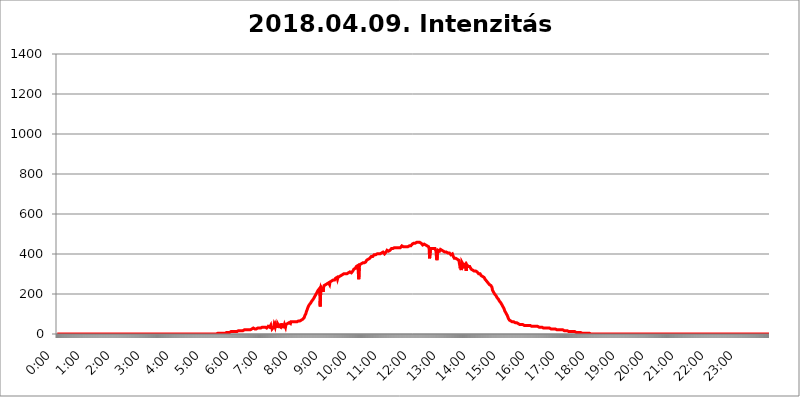
| Category | 2018.04.09. Intenzitás [W/m^2] |
|---|---|
| 0.0 | 0 |
| 0.0006944444444444445 | 0 |
| 0.001388888888888889 | 0 |
| 0.0020833333333333333 | 0 |
| 0.002777777777777778 | 0 |
| 0.003472222222222222 | 0 |
| 0.004166666666666667 | 0 |
| 0.004861111111111111 | 0 |
| 0.005555555555555556 | 0 |
| 0.0062499999999999995 | 0 |
| 0.006944444444444444 | 0 |
| 0.007638888888888889 | 0 |
| 0.008333333333333333 | 0 |
| 0.009027777777777779 | 0 |
| 0.009722222222222222 | 0 |
| 0.010416666666666666 | 0 |
| 0.011111111111111112 | 0 |
| 0.011805555555555555 | 0 |
| 0.012499999999999999 | 0 |
| 0.013194444444444444 | 0 |
| 0.013888888888888888 | 0 |
| 0.014583333333333332 | 0 |
| 0.015277777777777777 | 0 |
| 0.015972222222222224 | 0 |
| 0.016666666666666666 | 0 |
| 0.017361111111111112 | 0 |
| 0.018055555555555557 | 0 |
| 0.01875 | 0 |
| 0.019444444444444445 | 0 |
| 0.02013888888888889 | 0 |
| 0.020833333333333332 | 0 |
| 0.02152777777777778 | 0 |
| 0.022222222222222223 | 0 |
| 0.02291666666666667 | 0 |
| 0.02361111111111111 | 0 |
| 0.024305555555555556 | 0 |
| 0.024999999999999998 | 0 |
| 0.025694444444444447 | 0 |
| 0.02638888888888889 | 0 |
| 0.027083333333333334 | 0 |
| 0.027777777777777776 | 0 |
| 0.02847222222222222 | 0 |
| 0.029166666666666664 | 0 |
| 0.029861111111111113 | 0 |
| 0.030555555555555555 | 0 |
| 0.03125 | 0 |
| 0.03194444444444445 | 0 |
| 0.03263888888888889 | 0 |
| 0.03333333333333333 | 0 |
| 0.034027777777777775 | 0 |
| 0.034722222222222224 | 0 |
| 0.035416666666666666 | 0 |
| 0.036111111111111115 | 0 |
| 0.03680555555555556 | 0 |
| 0.0375 | 0 |
| 0.03819444444444444 | 0 |
| 0.03888888888888889 | 0 |
| 0.03958333333333333 | 0 |
| 0.04027777777777778 | 0 |
| 0.04097222222222222 | 0 |
| 0.041666666666666664 | 0 |
| 0.042361111111111106 | 0 |
| 0.04305555555555556 | 0 |
| 0.043750000000000004 | 0 |
| 0.044444444444444446 | 0 |
| 0.04513888888888889 | 0 |
| 0.04583333333333334 | 0 |
| 0.04652777777777778 | 0 |
| 0.04722222222222222 | 0 |
| 0.04791666666666666 | 0 |
| 0.04861111111111111 | 0 |
| 0.049305555555555554 | 0 |
| 0.049999999999999996 | 0 |
| 0.05069444444444445 | 0 |
| 0.051388888888888894 | 0 |
| 0.052083333333333336 | 0 |
| 0.05277777777777778 | 0 |
| 0.05347222222222222 | 0 |
| 0.05416666666666667 | 0 |
| 0.05486111111111111 | 0 |
| 0.05555555555555555 | 0 |
| 0.05625 | 0 |
| 0.05694444444444444 | 0 |
| 0.057638888888888885 | 0 |
| 0.05833333333333333 | 0 |
| 0.05902777777777778 | 0 |
| 0.059722222222222225 | 0 |
| 0.06041666666666667 | 0 |
| 0.061111111111111116 | 0 |
| 0.06180555555555556 | 0 |
| 0.0625 | 0 |
| 0.06319444444444444 | 0 |
| 0.06388888888888888 | 0 |
| 0.06458333333333334 | 0 |
| 0.06527777777777778 | 0 |
| 0.06597222222222222 | 0 |
| 0.06666666666666667 | 0 |
| 0.06736111111111111 | 0 |
| 0.06805555555555555 | 0 |
| 0.06874999999999999 | 0 |
| 0.06944444444444443 | 0 |
| 0.07013888888888889 | 0 |
| 0.07083333333333333 | 0 |
| 0.07152777777777779 | 0 |
| 0.07222222222222223 | 0 |
| 0.07291666666666667 | 0 |
| 0.07361111111111111 | 0 |
| 0.07430555555555556 | 0 |
| 0.075 | 0 |
| 0.07569444444444444 | 0 |
| 0.0763888888888889 | 0 |
| 0.07708333333333334 | 0 |
| 0.07777777777777778 | 0 |
| 0.07847222222222222 | 0 |
| 0.07916666666666666 | 0 |
| 0.0798611111111111 | 0 |
| 0.08055555555555556 | 0 |
| 0.08125 | 0 |
| 0.08194444444444444 | 0 |
| 0.08263888888888889 | 0 |
| 0.08333333333333333 | 0 |
| 0.08402777777777777 | 0 |
| 0.08472222222222221 | 0 |
| 0.08541666666666665 | 0 |
| 0.08611111111111112 | 0 |
| 0.08680555555555557 | 0 |
| 0.08750000000000001 | 0 |
| 0.08819444444444445 | 0 |
| 0.08888888888888889 | 0 |
| 0.08958333333333333 | 0 |
| 0.09027777777777778 | 0 |
| 0.09097222222222222 | 0 |
| 0.09166666666666667 | 0 |
| 0.09236111111111112 | 0 |
| 0.09305555555555556 | 0 |
| 0.09375 | 0 |
| 0.09444444444444444 | 0 |
| 0.09513888888888888 | 0 |
| 0.09583333333333333 | 0 |
| 0.09652777777777777 | 0 |
| 0.09722222222222222 | 0 |
| 0.09791666666666667 | 0 |
| 0.09861111111111111 | 0 |
| 0.09930555555555555 | 0 |
| 0.09999999999999999 | 0 |
| 0.10069444444444443 | 0 |
| 0.1013888888888889 | 0 |
| 0.10208333333333335 | 0 |
| 0.10277777777777779 | 0 |
| 0.10347222222222223 | 0 |
| 0.10416666666666667 | 0 |
| 0.10486111111111111 | 0 |
| 0.10555555555555556 | 0 |
| 0.10625 | 0 |
| 0.10694444444444444 | 0 |
| 0.1076388888888889 | 0 |
| 0.10833333333333334 | 0 |
| 0.10902777777777778 | 0 |
| 0.10972222222222222 | 0 |
| 0.1111111111111111 | 0 |
| 0.11180555555555556 | 0 |
| 0.11180555555555556 | 0 |
| 0.1125 | 0 |
| 0.11319444444444444 | 0 |
| 0.11388888888888889 | 0 |
| 0.11458333333333333 | 0 |
| 0.11527777777777777 | 0 |
| 0.11597222222222221 | 0 |
| 0.11666666666666665 | 0 |
| 0.1173611111111111 | 0 |
| 0.11805555555555557 | 0 |
| 0.11944444444444445 | 0 |
| 0.12013888888888889 | 0 |
| 0.12083333333333333 | 0 |
| 0.12152777777777778 | 0 |
| 0.12222222222222223 | 0 |
| 0.12291666666666667 | 0 |
| 0.12291666666666667 | 0 |
| 0.12361111111111112 | 0 |
| 0.12430555555555556 | 0 |
| 0.125 | 0 |
| 0.12569444444444444 | 0 |
| 0.12638888888888888 | 0 |
| 0.12708333333333333 | 0 |
| 0.16875 | 0 |
| 0.12847222222222224 | 0 |
| 0.12916666666666668 | 0 |
| 0.12986111111111112 | 0 |
| 0.13055555555555556 | 0 |
| 0.13125 | 0 |
| 0.13194444444444445 | 0 |
| 0.1326388888888889 | 0 |
| 0.13333333333333333 | 0 |
| 0.13402777777777777 | 0 |
| 0.13402777777777777 | 0 |
| 0.13472222222222222 | 0 |
| 0.13541666666666666 | 0 |
| 0.1361111111111111 | 0 |
| 0.13749999999999998 | 0 |
| 0.13819444444444443 | 0 |
| 0.1388888888888889 | 0 |
| 0.13958333333333334 | 0 |
| 0.14027777777777778 | 0 |
| 0.14097222222222222 | 0 |
| 0.14166666666666666 | 0 |
| 0.1423611111111111 | 0 |
| 0.14305555555555557 | 0 |
| 0.14375000000000002 | 0 |
| 0.14444444444444446 | 0 |
| 0.1451388888888889 | 0 |
| 0.1451388888888889 | 0 |
| 0.14652777777777778 | 0 |
| 0.14722222222222223 | 0 |
| 0.14791666666666667 | 0 |
| 0.1486111111111111 | 0 |
| 0.14930555555555555 | 0 |
| 0.15 | 0 |
| 0.15069444444444444 | 0 |
| 0.15138888888888888 | 0 |
| 0.15208333333333332 | 0 |
| 0.15277777777777776 | 0 |
| 0.15347222222222223 | 0 |
| 0.15416666666666667 | 0 |
| 0.15486111111111112 | 0 |
| 0.15555555555555556 | 0 |
| 0.15625 | 0 |
| 0.15694444444444444 | 0 |
| 0.15763888888888888 | 0 |
| 0.15833333333333333 | 0 |
| 0.15902777777777777 | 0 |
| 0.15972222222222224 | 0 |
| 0.16041666666666668 | 0 |
| 0.16111111111111112 | 0 |
| 0.16180555555555556 | 0 |
| 0.1625 | 0 |
| 0.16319444444444445 | 0 |
| 0.1638888888888889 | 0 |
| 0.16458333333333333 | 0 |
| 0.16527777777777777 | 0 |
| 0.16597222222222222 | 0 |
| 0.16666666666666666 | 0 |
| 0.1673611111111111 | 0 |
| 0.16805555555555554 | 0 |
| 0.16874999999999998 | 0 |
| 0.16944444444444443 | 0 |
| 0.17013888888888887 | 0 |
| 0.1708333333333333 | 0 |
| 0.17152777777777775 | 0 |
| 0.17222222222222225 | 0 |
| 0.1729166666666667 | 0 |
| 0.17361111111111113 | 0 |
| 0.17430555555555557 | 0 |
| 0.17500000000000002 | 0 |
| 0.17569444444444446 | 0 |
| 0.1763888888888889 | 0 |
| 0.17708333333333334 | 0 |
| 0.17777777777777778 | 0 |
| 0.17847222222222223 | 0 |
| 0.17916666666666667 | 0 |
| 0.1798611111111111 | 0 |
| 0.18055555555555555 | 0 |
| 0.18125 | 0 |
| 0.18194444444444444 | 0 |
| 0.1826388888888889 | 0 |
| 0.18333333333333335 | 0 |
| 0.1840277777777778 | 0 |
| 0.18472222222222223 | 0 |
| 0.18541666666666667 | 0 |
| 0.18611111111111112 | 0 |
| 0.18680555555555556 | 0 |
| 0.1875 | 0 |
| 0.18819444444444444 | 0 |
| 0.18888888888888888 | 0 |
| 0.18958333333333333 | 0 |
| 0.19027777777777777 | 0 |
| 0.1909722222222222 | 0 |
| 0.19166666666666665 | 0 |
| 0.19236111111111112 | 0 |
| 0.19305555555555554 | 0 |
| 0.19375 | 0 |
| 0.19444444444444445 | 0 |
| 0.1951388888888889 | 0 |
| 0.19583333333333333 | 0 |
| 0.19652777777777777 | 0 |
| 0.19722222222222222 | 0 |
| 0.19791666666666666 | 0 |
| 0.1986111111111111 | 0 |
| 0.19930555555555554 | 0 |
| 0.19999999999999998 | 0 |
| 0.20069444444444443 | 0 |
| 0.20138888888888887 | 0 |
| 0.2020833333333333 | 0 |
| 0.2027777777777778 | 0 |
| 0.2034722222222222 | 0 |
| 0.2041666666666667 | 0 |
| 0.20486111111111113 | 0 |
| 0.20555555555555557 | 0 |
| 0.20625000000000002 | 0 |
| 0.20694444444444446 | 0 |
| 0.2076388888888889 | 0 |
| 0.20833333333333334 | 0 |
| 0.20902777777777778 | 0 |
| 0.20972222222222223 | 0 |
| 0.21041666666666667 | 0 |
| 0.2111111111111111 | 0 |
| 0.21180555555555555 | 0 |
| 0.2125 | 0 |
| 0.21319444444444444 | 0 |
| 0.2138888888888889 | 0 |
| 0.21458333333333335 | 0 |
| 0.2152777777777778 | 0 |
| 0.21597222222222223 | 0 |
| 0.21666666666666667 | 0 |
| 0.21736111111111112 | 0 |
| 0.21805555555555556 | 0 |
| 0.21875 | 0 |
| 0.21944444444444444 | 0 |
| 0.22013888888888888 | 0 |
| 0.22083333333333333 | 0 |
| 0.22152777777777777 | 0 |
| 0.2222222222222222 | 0 |
| 0.22291666666666665 | 0 |
| 0.2236111111111111 | 0 |
| 0.22430555555555556 | 3.525 |
| 0.225 | 3.525 |
| 0.22569444444444445 | 3.525 |
| 0.2263888888888889 | 3.525 |
| 0.22708333333333333 | 3.525 |
| 0.22777777777777777 | 3.525 |
| 0.22847222222222222 | 3.525 |
| 0.22916666666666666 | 3.525 |
| 0.2298611111111111 | 3.525 |
| 0.23055555555555554 | 3.525 |
| 0.23124999999999998 | 3.525 |
| 0.23194444444444443 | 3.525 |
| 0.23263888888888887 | 3.525 |
| 0.2333333333333333 | 3.525 |
| 0.2340277777777778 | 3.525 |
| 0.2347222222222222 | 7.887 |
| 0.2354166666666667 | 3.525 |
| 0.23611111111111113 | 7.887 |
| 0.23680555555555557 | 7.887 |
| 0.23750000000000002 | 7.887 |
| 0.23819444444444446 | 7.887 |
| 0.2388888888888889 | 7.887 |
| 0.23958333333333334 | 7.887 |
| 0.24027777777777778 | 7.887 |
| 0.24097222222222223 | 7.887 |
| 0.24166666666666667 | 7.887 |
| 0.2423611111111111 | 12.257 |
| 0.24305555555555555 | 12.257 |
| 0.24375 | 12.257 |
| 0.24444444444444446 | 12.257 |
| 0.24513888888888888 | 12.257 |
| 0.24583333333333335 | 12.257 |
| 0.2465277777777778 | 12.257 |
| 0.24722222222222223 | 12.257 |
| 0.24791666666666667 | 12.257 |
| 0.24861111111111112 | 12.257 |
| 0.24930555555555556 | 12.257 |
| 0.25 | 12.257 |
| 0.25069444444444444 | 12.257 |
| 0.2513888888888889 | 12.257 |
| 0.2520833333333333 | 12.257 |
| 0.25277777777777777 | 12.257 |
| 0.2534722222222222 | 16.636 |
| 0.25416666666666665 | 16.636 |
| 0.2548611111111111 | 16.636 |
| 0.2555555555555556 | 16.636 |
| 0.25625000000000003 | 16.636 |
| 0.2569444444444445 | 16.636 |
| 0.2576388888888889 | 16.636 |
| 0.25833333333333336 | 16.636 |
| 0.2590277777777778 | 16.636 |
| 0.25972222222222224 | 16.636 |
| 0.2604166666666667 | 16.636 |
| 0.2611111111111111 | 16.636 |
| 0.26180555555555557 | 16.636 |
| 0.2625 | 21.024 |
| 0.26319444444444445 | 21.024 |
| 0.2638888888888889 | 21.024 |
| 0.26458333333333334 | 21.024 |
| 0.2652777777777778 | 21.024 |
| 0.2659722222222222 | 21.024 |
| 0.26666666666666666 | 21.024 |
| 0.2673611111111111 | 21.024 |
| 0.26805555555555555 | 21.024 |
| 0.26875 | 21.024 |
| 0.26944444444444443 | 21.024 |
| 0.2701388888888889 | 21.024 |
| 0.2708333333333333 | 21.024 |
| 0.27152777777777776 | 25.419 |
| 0.2722222222222222 | 25.419 |
| 0.27291666666666664 | 25.419 |
| 0.2736111111111111 | 25.419 |
| 0.2743055555555555 | 25.419 |
| 0.27499999999999997 | 29.823 |
| 0.27569444444444446 | 25.419 |
| 0.27638888888888885 | 25.419 |
| 0.27708333333333335 | 25.419 |
| 0.2777777777777778 | 25.419 |
| 0.27847222222222223 | 25.419 |
| 0.2791666666666667 | 25.419 |
| 0.2798611111111111 | 29.823 |
| 0.28055555555555556 | 29.823 |
| 0.28125 | 29.823 |
| 0.28194444444444444 | 29.823 |
| 0.2826388888888889 | 29.823 |
| 0.2833333333333333 | 29.823 |
| 0.28402777777777777 | 29.823 |
| 0.2847222222222222 | 29.823 |
| 0.28541666666666665 | 29.823 |
| 0.28611111111111115 | 29.823 |
| 0.28680555555555554 | 29.823 |
| 0.28750000000000003 | 34.234 |
| 0.2881944444444445 | 29.823 |
| 0.2888888888888889 | 34.234 |
| 0.28958333333333336 | 34.234 |
| 0.2902777777777778 | 34.234 |
| 0.29097222222222224 | 34.234 |
| 0.2916666666666667 | 34.234 |
| 0.2923611111111111 | 38.653 |
| 0.29305555555555557 | 38.653 |
| 0.29375 | 29.823 |
| 0.29444444444444445 | 25.419 |
| 0.2951388888888889 | 29.823 |
| 0.29583333333333334 | 38.653 |
| 0.2965277777777778 | 38.653 |
| 0.2972222222222222 | 38.653 |
| 0.29791666666666666 | 34.234 |
| 0.2986111111111111 | 38.653 |
| 0.29930555555555555 | 43.079 |
| 0.3 | 25.419 |
| 0.30069444444444443 | 38.653 |
| 0.3013888888888889 | 25.419 |
| 0.3020833333333333 | 29.823 |
| 0.30277777777777776 | 29.823 |
| 0.3034722222222222 | 34.234 |
| 0.30416666666666664 | 47.511 |
| 0.3048611111111111 | 43.079 |
| 0.3055555555555555 | 34.234 |
| 0.30624999999999997 | 47.511 |
| 0.3069444444444444 | 43.079 |
| 0.3076388888888889 | 43.079 |
| 0.30833333333333335 | 29.823 |
| 0.3090277777777778 | 51.951 |
| 0.30972222222222223 | 51.951 |
| 0.3104166666666667 | 47.511 |
| 0.3111111111111111 | 38.653 |
| 0.31180555555555556 | 34.234 |
| 0.3125 | 43.079 |
| 0.31319444444444444 | 34.234 |
| 0.3138888888888889 | 51.951 |
| 0.3145833333333333 | 34.234 |
| 0.31527777777777777 | 51.951 |
| 0.3159722222222222 | 29.823 |
| 0.31666666666666665 | 47.511 |
| 0.31736111111111115 | 29.823 |
| 0.31805555555555554 | 38.653 |
| 0.31875000000000003 | 47.511 |
| 0.3194444444444445 | 51.951 |
| 0.3201388888888889 | 34.234 |
| 0.32083333333333336 | 47.511 |
| 0.3215277777777778 | 47.511 |
| 0.32222222222222224 | 47.511 |
| 0.3229166666666667 | 51.951 |
| 0.3236111111111111 | 51.951 |
| 0.32430555555555557 | 51.951 |
| 0.325 | 56.398 |
| 0.32569444444444445 | 56.398 |
| 0.3263888888888889 | 56.398 |
| 0.32708333333333334 | 51.951 |
| 0.3277777777777778 | 60.85 |
| 0.3284722222222222 | 60.85 |
| 0.32916666666666666 | 60.85 |
| 0.3298611111111111 | 60.85 |
| 0.33055555555555555 | 60.85 |
| 0.33125 | 60.85 |
| 0.33194444444444443 | 60.85 |
| 0.3326388888888889 | 60.85 |
| 0.3333333333333333 | 60.85 |
| 0.3340277777777778 | 60.85 |
| 0.3347222222222222 | 60.85 |
| 0.3354166666666667 | 60.85 |
| 0.3361111111111111 | 60.85 |
| 0.3368055555555556 | 60.85 |
| 0.33749999999999997 | 60.85 |
| 0.33819444444444446 | 65.31 |
| 0.33888888888888885 | 65.31 |
| 0.33958333333333335 | 65.31 |
| 0.34027777777777773 | 65.31 |
| 0.34097222222222223 | 65.31 |
| 0.3416666666666666 | 65.31 |
| 0.3423611111111111 | 69.775 |
| 0.3430555555555555 | 69.775 |
| 0.34375 | 74.246 |
| 0.3444444444444445 | 74.246 |
| 0.3451388888888889 | 78.722 |
| 0.3458333333333334 | 78.722 |
| 0.34652777777777777 | 83.205 |
| 0.34722222222222227 | 92.184 |
| 0.34791666666666665 | 96.682 |
| 0.34861111111111115 | 101.184 |
| 0.34930555555555554 | 110.201 |
| 0.35000000000000003 | 114.716 |
| 0.3506944444444444 | 123.758 |
| 0.3513888888888889 | 128.284 |
| 0.3520833333333333 | 137.347 |
| 0.3527777777777778 | 141.884 |
| 0.3534722222222222 | 146.423 |
| 0.3541666666666667 | 146.423 |
| 0.3548611111111111 | 150.964 |
| 0.35555555555555557 | 155.509 |
| 0.35625 | 160.056 |
| 0.35694444444444445 | 164.605 |
| 0.3576388888888889 | 164.605 |
| 0.35833333333333334 | 169.156 |
| 0.3590277777777778 | 173.709 |
| 0.3597222222222222 | 178.264 |
| 0.36041666666666666 | 182.82 |
| 0.3611111111111111 | 187.378 |
| 0.36180555555555555 | 191.937 |
| 0.3625 | 196.497 |
| 0.36319444444444443 | 201.058 |
| 0.3638888888888889 | 205.62 |
| 0.3645833333333333 | 210.182 |
| 0.3652777777777778 | 214.746 |
| 0.3659722222222222 | 219.309 |
| 0.3666666666666667 | 223.873 |
| 0.3673611111111111 | 223.873 |
| 0.3680555555555556 | 228.436 |
| 0.36874999999999997 | 137.347 |
| 0.36944444444444446 | 201.058 |
| 0.37013888888888885 | 233 |
| 0.37083333333333335 | 233 |
| 0.37152777777777773 | 228.436 |
| 0.37222222222222223 | 219.309 |
| 0.3729166666666666 | 210.182 |
| 0.3736111111111111 | 233 |
| 0.3743055555555555 | 242.127 |
| 0.375 | 242.127 |
| 0.3756944444444445 | 242.127 |
| 0.3763888888888889 | 246.689 |
| 0.3770833333333334 | 246.689 |
| 0.37777777777777777 | 251.251 |
| 0.37847222222222227 | 251.251 |
| 0.37916666666666665 | 251.251 |
| 0.37986111111111115 | 251.251 |
| 0.38055555555555554 | 255.813 |
| 0.38125000000000003 | 260.373 |
| 0.3819444444444444 | 246.689 |
| 0.3826388888888889 | 260.373 |
| 0.3833333333333333 | 260.373 |
| 0.3840277777777778 | 260.373 |
| 0.3847222222222222 | 264.932 |
| 0.3854166666666667 | 269.49 |
| 0.3861111111111111 | 269.49 |
| 0.38680555555555557 | 269.49 |
| 0.3875 | 269.49 |
| 0.38819444444444445 | 274.047 |
| 0.3888888888888889 | 269.49 |
| 0.38958333333333334 | 269.49 |
| 0.3902777777777778 | 278.603 |
| 0.3909722222222222 | 278.603 |
| 0.39166666666666666 | 283.156 |
| 0.3923611111111111 | 283.156 |
| 0.39305555555555555 | 274.047 |
| 0.39375 | 283.156 |
| 0.39444444444444443 | 287.709 |
| 0.3951388888888889 | 287.709 |
| 0.3958333333333333 | 287.709 |
| 0.3965277777777778 | 292.259 |
| 0.3972222222222222 | 292.259 |
| 0.3979166666666667 | 292.259 |
| 0.3986111111111111 | 292.259 |
| 0.3993055555555556 | 296.808 |
| 0.39999999999999997 | 296.808 |
| 0.40069444444444446 | 301.354 |
| 0.40138888888888885 | 296.808 |
| 0.40208333333333335 | 301.354 |
| 0.40277777777777773 | 301.354 |
| 0.40347222222222223 | 301.354 |
| 0.4041666666666666 | 301.354 |
| 0.4048611111111111 | 301.354 |
| 0.4055555555555555 | 305.898 |
| 0.40625 | 301.354 |
| 0.4069444444444445 | 305.898 |
| 0.4076388888888889 | 305.898 |
| 0.4083333333333334 | 305.898 |
| 0.40902777777777777 | 305.898 |
| 0.40972222222222227 | 305.898 |
| 0.41041666666666665 | 310.44 |
| 0.41111111111111115 | 310.44 |
| 0.41180555555555554 | 310.44 |
| 0.41250000000000003 | 305.898 |
| 0.4131944444444444 | 305.898 |
| 0.4138888888888889 | 310.44 |
| 0.4145833333333333 | 314.98 |
| 0.4152777777777778 | 314.98 |
| 0.4159722222222222 | 324.052 |
| 0.4166666666666667 | 324.052 |
| 0.4173611111111111 | 324.052 |
| 0.41805555555555557 | 328.584 |
| 0.41875 | 333.113 |
| 0.41944444444444445 | 337.639 |
| 0.4201388888888889 | 337.639 |
| 0.42083333333333334 | 342.162 |
| 0.4215277777777778 | 342.162 |
| 0.4222222222222222 | 342.162 |
| 0.42291666666666666 | 274.047 |
| 0.4236111111111111 | 333.113 |
| 0.42430555555555555 | 346.682 |
| 0.425 | 342.162 |
| 0.42569444444444443 | 351.198 |
| 0.4263888888888889 | 351.198 |
| 0.4270833333333333 | 355.712 |
| 0.4277777777777778 | 351.198 |
| 0.4284722222222222 | 355.712 |
| 0.4291666666666667 | 355.712 |
| 0.4298611111111111 | 355.712 |
| 0.4305555555555556 | 355.712 |
| 0.43124999999999997 | 360.221 |
| 0.43194444444444446 | 360.221 |
| 0.43263888888888885 | 360.221 |
| 0.43333333333333335 | 364.728 |
| 0.43402777777777773 | 369.23 |
| 0.43472222222222223 | 369.23 |
| 0.4354166666666666 | 369.23 |
| 0.4361111111111111 | 373.729 |
| 0.4368055555555555 | 378.224 |
| 0.4375 | 373.729 |
| 0.4381944444444445 | 378.224 |
| 0.4388888888888889 | 382.715 |
| 0.4395833333333334 | 382.715 |
| 0.44027777777777777 | 387.202 |
| 0.44097222222222227 | 382.715 |
| 0.44166666666666665 | 382.715 |
| 0.44236111111111115 | 387.202 |
| 0.44305555555555554 | 391.685 |
| 0.44375000000000003 | 391.685 |
| 0.4444444444444444 | 396.164 |
| 0.4451388888888889 | 396.164 |
| 0.4458333333333333 | 396.164 |
| 0.4465277777777778 | 396.164 |
| 0.4472222222222222 | 400.638 |
| 0.4479166666666667 | 400.638 |
| 0.4486111111111111 | 400.638 |
| 0.44930555555555557 | 396.164 |
| 0.45 | 400.638 |
| 0.45069444444444445 | 400.638 |
| 0.4513888888888889 | 400.638 |
| 0.45208333333333334 | 400.638 |
| 0.4527777777777778 | 400.638 |
| 0.4534722222222222 | 405.108 |
| 0.45416666666666666 | 400.638 |
| 0.4548611111111111 | 405.108 |
| 0.45555555555555555 | 405.108 |
| 0.45625 | 409.574 |
| 0.45694444444444443 | 409.574 |
| 0.4576388888888889 | 409.574 |
| 0.4583333333333333 | 405.108 |
| 0.4590277777777778 | 400.638 |
| 0.4597222222222222 | 400.638 |
| 0.4604166666666667 | 400.638 |
| 0.4611111111111111 | 409.574 |
| 0.4618055555555556 | 405.108 |
| 0.46249999999999997 | 418.492 |
| 0.46319444444444446 | 414.035 |
| 0.46388888888888885 | 418.492 |
| 0.46458333333333335 | 414.035 |
| 0.46527777777777773 | 414.035 |
| 0.46597222222222223 | 414.035 |
| 0.4666666666666666 | 418.492 |
| 0.4673611111111111 | 422.943 |
| 0.4680555555555555 | 422.943 |
| 0.46875 | 427.39 |
| 0.4694444444444445 | 427.39 |
| 0.4701388888888889 | 427.39 |
| 0.4708333333333334 | 427.39 |
| 0.47152777777777777 | 427.39 |
| 0.47222222222222227 | 431.833 |
| 0.47291666666666665 | 431.833 |
| 0.47361111111111115 | 431.833 |
| 0.47430555555555554 | 431.833 |
| 0.47500000000000003 | 431.833 |
| 0.4756944444444444 | 431.833 |
| 0.4763888888888889 | 427.39 |
| 0.4770833333333333 | 431.833 |
| 0.4777777777777778 | 431.833 |
| 0.4784722222222222 | 431.833 |
| 0.4791666666666667 | 431.833 |
| 0.4798611111111111 | 431.833 |
| 0.48055555555555557 | 431.833 |
| 0.48125 | 431.833 |
| 0.48194444444444445 | 431.833 |
| 0.4826388888888889 | 436.27 |
| 0.48333333333333334 | 440.702 |
| 0.4840277777777778 | 440.702 |
| 0.4847222222222222 | 436.27 |
| 0.48541666666666666 | 436.27 |
| 0.4861111111111111 | 436.27 |
| 0.48680555555555555 | 436.27 |
| 0.4875 | 436.27 |
| 0.48819444444444443 | 431.833 |
| 0.4888888888888889 | 436.27 |
| 0.4895833333333333 | 436.27 |
| 0.4902777777777778 | 436.27 |
| 0.4909722222222222 | 436.27 |
| 0.4916666666666667 | 436.27 |
| 0.4923611111111111 | 440.702 |
| 0.4930555555555556 | 440.702 |
| 0.49374999999999997 | 440.702 |
| 0.49444444444444446 | 440.702 |
| 0.49513888888888885 | 440.702 |
| 0.49583333333333335 | 440.702 |
| 0.49652777777777773 | 445.129 |
| 0.49722222222222223 | 445.129 |
| 0.4979166666666666 | 449.551 |
| 0.4986111111111111 | 449.551 |
| 0.4993055555555555 | 453.968 |
| 0.5 | 453.968 |
| 0.5006944444444444 | 453.968 |
| 0.5013888888888889 | 453.968 |
| 0.5020833333333333 | 453.968 |
| 0.5027777777777778 | 453.968 |
| 0.5034722222222222 | 453.968 |
| 0.5041666666666667 | 458.38 |
| 0.5048611111111111 | 458.38 |
| 0.5055555555555555 | 458.38 |
| 0.50625 | 458.38 |
| 0.5069444444444444 | 458.38 |
| 0.5076388888888889 | 453.968 |
| 0.5083333333333333 | 458.38 |
| 0.5090277777777777 | 453.968 |
| 0.5097222222222222 | 453.968 |
| 0.5104166666666666 | 453.968 |
| 0.5111111111111112 | 453.968 |
| 0.5118055555555555 | 449.551 |
| 0.5125000000000001 | 445.129 |
| 0.5131944444444444 | 445.129 |
| 0.513888888888889 | 445.129 |
| 0.5145833333333333 | 449.551 |
| 0.5152777777777778 | 445.129 |
| 0.5159722222222222 | 445.129 |
| 0.5166666666666667 | 445.129 |
| 0.517361111111111 | 445.129 |
| 0.5180555555555556 | 445.129 |
| 0.5187499999999999 | 440.702 |
| 0.5194444444444445 | 440.702 |
| 0.5201388888888888 | 440.702 |
| 0.5208333333333334 | 436.27 |
| 0.5215277777777778 | 427.39 |
| 0.5222222222222223 | 378.224 |
| 0.5229166666666667 | 378.224 |
| 0.5236111111111111 | 427.39 |
| 0.5243055555555556 | 431.833 |
| 0.525 | 431.833 |
| 0.5256944444444445 | 427.39 |
| 0.5263888888888889 | 427.39 |
| 0.5270833333333333 | 427.39 |
| 0.5277777777777778 | 427.39 |
| 0.5284722222222222 | 431.833 |
| 0.5291666666666667 | 431.833 |
| 0.5298611111111111 | 427.39 |
| 0.5305555555555556 | 422.943 |
| 0.53125 | 414.035 |
| 0.5319444444444444 | 378.224 |
| 0.5326388888888889 | 369.23 |
| 0.5333333333333333 | 409.574 |
| 0.5340277777777778 | 418.492 |
| 0.5347222222222222 | 418.492 |
| 0.5354166666666667 | 418.492 |
| 0.5361111111111111 | 414.035 |
| 0.5368055555555555 | 418.492 |
| 0.5375 | 422.943 |
| 0.5381944444444444 | 422.943 |
| 0.5388888888888889 | 422.943 |
| 0.5395833333333333 | 418.492 |
| 0.5402777777777777 | 418.492 |
| 0.5409722222222222 | 414.035 |
| 0.5416666666666666 | 414.035 |
| 0.5423611111111112 | 414.035 |
| 0.5430555555555555 | 409.574 |
| 0.5437500000000001 | 409.574 |
| 0.5444444444444444 | 409.574 |
| 0.545138888888889 | 409.574 |
| 0.5458333333333333 | 409.574 |
| 0.5465277777777778 | 405.108 |
| 0.5472222222222222 | 409.574 |
| 0.5479166666666667 | 405.108 |
| 0.548611111111111 | 405.108 |
| 0.5493055555555556 | 405.108 |
| 0.5499999999999999 | 405.108 |
| 0.5506944444444445 | 405.108 |
| 0.5513888888888888 | 400.638 |
| 0.5520833333333334 | 396.164 |
| 0.5527777777777778 | 396.164 |
| 0.5534722222222223 | 396.164 |
| 0.5541666666666667 | 400.638 |
| 0.5548611111111111 | 396.164 |
| 0.5555555555555556 | 387.202 |
| 0.55625 | 387.202 |
| 0.5569444444444445 | 378.224 |
| 0.5576388888888889 | 378.224 |
| 0.5583333333333333 | 378.224 |
| 0.5590277777777778 | 378.224 |
| 0.5597222222222222 | 378.224 |
| 0.5604166666666667 | 378.224 |
| 0.5611111111111111 | 373.729 |
| 0.5618055555555556 | 373.729 |
| 0.5625 | 369.23 |
| 0.5631944444444444 | 369.23 |
| 0.5638888888888889 | 369.23 |
| 0.5645833333333333 | 364.728 |
| 0.5652777777777778 | 328.584 |
| 0.5659722222222222 | 355.712 |
| 0.5666666666666667 | 319.517 |
| 0.5673611111111111 | 360.221 |
| 0.5680555555555555 | 355.712 |
| 0.56875 | 351.198 |
| 0.5694444444444444 | 328.584 |
| 0.5701388888888889 | 324.052 |
| 0.5708333333333333 | 346.682 |
| 0.5715277777777777 | 351.198 |
| 0.5722222222222222 | 351.198 |
| 0.5729166666666666 | 351.198 |
| 0.5736111111111112 | 314.98 |
| 0.5743055555555555 | 346.682 |
| 0.5750000000000001 | 342.162 |
| 0.5756944444444444 | 342.162 |
| 0.576388888888889 | 337.639 |
| 0.5770833333333333 | 337.639 |
| 0.5777777777777778 | 337.639 |
| 0.5784722222222222 | 337.639 |
| 0.5791666666666667 | 333.113 |
| 0.579861111111111 | 333.113 |
| 0.5805555555555556 | 324.052 |
| 0.5812499999999999 | 328.584 |
| 0.5819444444444445 | 324.052 |
| 0.5826388888888888 | 319.517 |
| 0.5833333333333334 | 324.052 |
| 0.5840277777777778 | 319.517 |
| 0.5847222222222223 | 314.98 |
| 0.5854166666666667 | 314.98 |
| 0.5861111111111111 | 314.98 |
| 0.5868055555555556 | 314.98 |
| 0.5875 | 314.98 |
| 0.5881944444444445 | 310.44 |
| 0.5888888888888889 | 310.44 |
| 0.5895833333333333 | 305.898 |
| 0.5902777777777778 | 305.898 |
| 0.5909722222222222 | 301.354 |
| 0.5916666666666667 | 301.354 |
| 0.5923611111111111 | 305.898 |
| 0.5930555555555556 | 301.354 |
| 0.59375 | 296.808 |
| 0.5944444444444444 | 292.259 |
| 0.5951388888888889 | 287.709 |
| 0.5958333333333333 | 287.709 |
| 0.5965277777777778 | 287.709 |
| 0.5972222222222222 | 287.709 |
| 0.5979166666666667 | 283.156 |
| 0.5986111111111111 | 283.156 |
| 0.5993055555555555 | 278.603 |
| 0.6 | 274.047 |
| 0.6006944444444444 | 274.047 |
| 0.6013888888888889 | 269.49 |
| 0.6020833333333333 | 264.932 |
| 0.6027777777777777 | 264.932 |
| 0.6034722222222222 | 260.373 |
| 0.6041666666666666 | 255.813 |
| 0.6048611111111112 | 251.251 |
| 0.6055555555555555 | 251.251 |
| 0.6062500000000001 | 246.689 |
| 0.6069444444444444 | 246.689 |
| 0.607638888888889 | 242.127 |
| 0.6083333333333333 | 242.127 |
| 0.6090277777777778 | 237.564 |
| 0.6097222222222222 | 233 |
| 0.6104166666666667 | 219.309 |
| 0.611111111111111 | 214.746 |
| 0.6118055555555556 | 210.182 |
| 0.6124999999999999 | 205.62 |
| 0.6131944444444445 | 201.058 |
| 0.6138888888888888 | 196.497 |
| 0.6145833333333334 | 196.497 |
| 0.6152777777777778 | 191.937 |
| 0.6159722222222223 | 187.378 |
| 0.6166666666666667 | 182.82 |
| 0.6173611111111111 | 178.264 |
| 0.6180555555555556 | 178.264 |
| 0.61875 | 173.709 |
| 0.6194444444444445 | 169.156 |
| 0.6201388888888889 | 164.605 |
| 0.6208333333333333 | 164.605 |
| 0.6215277777777778 | 160.056 |
| 0.6222222222222222 | 155.509 |
| 0.6229166666666667 | 150.964 |
| 0.6236111111111111 | 146.423 |
| 0.6243055555555556 | 141.884 |
| 0.625 | 137.347 |
| 0.6256944444444444 | 132.814 |
| 0.6263888888888889 | 128.284 |
| 0.6270833333333333 | 123.758 |
| 0.6277777777777778 | 114.716 |
| 0.6284722222222222 | 110.201 |
| 0.6291666666666667 | 105.69 |
| 0.6298611111111111 | 101.184 |
| 0.6305555555555555 | 101.184 |
| 0.63125 | 92.184 |
| 0.6319444444444444 | 87.692 |
| 0.6326388888888889 | 78.722 |
| 0.6333333333333333 | 74.246 |
| 0.6340277777777777 | 69.775 |
| 0.6347222222222222 | 65.31 |
| 0.6354166666666666 | 65.31 |
| 0.6361111111111112 | 65.31 |
| 0.6368055555555555 | 65.31 |
| 0.6375000000000001 | 65.31 |
| 0.6381944444444444 | 60.85 |
| 0.638888888888889 | 60.85 |
| 0.6395833333333333 | 60.85 |
| 0.6402777777777778 | 60.85 |
| 0.6409722222222222 | 60.85 |
| 0.6416666666666667 | 56.398 |
| 0.642361111111111 | 56.398 |
| 0.6430555555555556 | 56.398 |
| 0.6437499999999999 | 56.398 |
| 0.6444444444444445 | 56.398 |
| 0.6451388888888888 | 56.398 |
| 0.6458333333333334 | 51.951 |
| 0.6465277777777778 | 51.951 |
| 0.6472222222222223 | 51.951 |
| 0.6479166666666667 | 51.951 |
| 0.6486111111111111 | 47.511 |
| 0.6493055555555556 | 47.511 |
| 0.65 | 47.511 |
| 0.6506944444444445 | 47.511 |
| 0.6513888888888889 | 47.511 |
| 0.6520833333333333 | 47.511 |
| 0.6527777777777778 | 47.511 |
| 0.6534722222222222 | 47.511 |
| 0.6541666666666667 | 47.511 |
| 0.6548611111111111 | 43.079 |
| 0.6555555555555556 | 43.079 |
| 0.65625 | 43.079 |
| 0.6569444444444444 | 43.079 |
| 0.6576388888888889 | 43.079 |
| 0.6583333333333333 | 43.079 |
| 0.6590277777777778 | 43.079 |
| 0.6597222222222222 | 43.079 |
| 0.6604166666666667 | 43.079 |
| 0.6611111111111111 | 43.079 |
| 0.6618055555555555 | 43.079 |
| 0.6625 | 38.653 |
| 0.6631944444444444 | 43.079 |
| 0.6638888888888889 | 38.653 |
| 0.6645833333333333 | 38.653 |
| 0.6652777777777777 | 38.653 |
| 0.6659722222222222 | 38.653 |
| 0.6666666666666666 | 38.653 |
| 0.6673611111111111 | 38.653 |
| 0.6680555555555556 | 38.653 |
| 0.6687500000000001 | 38.653 |
| 0.6694444444444444 | 38.653 |
| 0.6701388888888888 | 38.653 |
| 0.6708333333333334 | 38.653 |
| 0.6715277777777778 | 38.653 |
| 0.6722222222222222 | 38.653 |
| 0.6729166666666666 | 34.234 |
| 0.6736111111111112 | 38.653 |
| 0.6743055555555556 | 34.234 |
| 0.6749999999999999 | 34.234 |
| 0.6756944444444444 | 34.234 |
| 0.6763888888888889 | 34.234 |
| 0.6770833333333334 | 34.234 |
| 0.6777777777777777 | 34.234 |
| 0.6784722222222223 | 34.234 |
| 0.6791666666666667 | 34.234 |
| 0.6798611111111111 | 34.234 |
| 0.6805555555555555 | 29.823 |
| 0.68125 | 34.234 |
| 0.6819444444444445 | 29.823 |
| 0.6826388888888889 | 29.823 |
| 0.6833333333333332 | 29.823 |
| 0.6840277777777778 | 29.823 |
| 0.6847222222222222 | 29.823 |
| 0.6854166666666667 | 29.823 |
| 0.686111111111111 | 29.823 |
| 0.6868055555555556 | 29.823 |
| 0.6875 | 29.823 |
| 0.6881944444444444 | 29.823 |
| 0.688888888888889 | 29.823 |
| 0.6895833333333333 | 29.823 |
| 0.6902777777777778 | 29.823 |
| 0.6909722222222222 | 25.419 |
| 0.6916666666666668 | 25.419 |
| 0.6923611111111111 | 25.419 |
| 0.6930555555555555 | 25.419 |
| 0.69375 | 25.419 |
| 0.6944444444444445 | 25.419 |
| 0.6951388888888889 | 25.419 |
| 0.6958333333333333 | 25.419 |
| 0.6965277777777777 | 25.419 |
| 0.6972222222222223 | 25.419 |
| 0.6979166666666666 | 25.419 |
| 0.6986111111111111 | 25.419 |
| 0.6993055555555556 | 25.419 |
| 0.7000000000000001 | 21.024 |
| 0.7006944444444444 | 21.024 |
| 0.7013888888888888 | 21.024 |
| 0.7020833333333334 | 21.024 |
| 0.7027777777777778 | 21.024 |
| 0.7034722222222222 | 21.024 |
| 0.7041666666666666 | 21.024 |
| 0.7048611111111112 | 21.024 |
| 0.7055555555555556 | 21.024 |
| 0.7062499999999999 | 21.024 |
| 0.7069444444444444 | 21.024 |
| 0.7076388888888889 | 21.024 |
| 0.7083333333333334 | 21.024 |
| 0.7090277777777777 | 21.024 |
| 0.7097222222222223 | 16.636 |
| 0.7104166666666667 | 16.636 |
| 0.7111111111111111 | 16.636 |
| 0.7118055555555555 | 16.636 |
| 0.7125 | 16.636 |
| 0.7131944444444445 | 16.636 |
| 0.7138888888888889 | 16.636 |
| 0.7145833333333332 | 16.636 |
| 0.7152777777777778 | 16.636 |
| 0.7159722222222222 | 16.636 |
| 0.7166666666666667 | 12.257 |
| 0.717361111111111 | 12.257 |
| 0.7180555555555556 | 12.257 |
| 0.71875 | 12.257 |
| 0.7194444444444444 | 12.257 |
| 0.720138888888889 | 12.257 |
| 0.7208333333333333 | 12.257 |
| 0.7215277777777778 | 12.257 |
| 0.7222222222222222 | 12.257 |
| 0.7229166666666668 | 12.257 |
| 0.7236111111111111 | 12.257 |
| 0.7243055555555555 | 12.257 |
| 0.725 | 12.257 |
| 0.7256944444444445 | 12.257 |
| 0.7263888888888889 | 12.257 |
| 0.7270833333333333 | 7.887 |
| 0.7277777777777777 | 7.887 |
| 0.7284722222222223 | 7.887 |
| 0.7291666666666666 | 7.887 |
| 0.7298611111111111 | 7.887 |
| 0.7305555555555556 | 7.887 |
| 0.7312500000000001 | 7.887 |
| 0.7319444444444444 | 7.887 |
| 0.7326388888888888 | 7.887 |
| 0.7333333333333334 | 7.887 |
| 0.7340277777777778 | 7.887 |
| 0.7347222222222222 | 7.887 |
| 0.7354166666666666 | 7.887 |
| 0.7361111111111112 | 3.525 |
| 0.7368055555555556 | 3.525 |
| 0.7374999999999999 | 3.525 |
| 0.7381944444444444 | 3.525 |
| 0.7388888888888889 | 3.525 |
| 0.7395833333333334 | 3.525 |
| 0.7402777777777777 | 3.525 |
| 0.7409722222222223 | 3.525 |
| 0.7416666666666667 | 3.525 |
| 0.7423611111111111 | 3.525 |
| 0.7430555555555555 | 3.525 |
| 0.74375 | 3.525 |
| 0.7444444444444445 | 3.525 |
| 0.7451388888888889 | 3.525 |
| 0.7458333333333332 | 3.525 |
| 0.7465277777777778 | 3.525 |
| 0.7472222222222222 | 3.525 |
| 0.7479166666666667 | 3.525 |
| 0.748611111111111 | 0 |
| 0.7493055555555556 | 0 |
| 0.75 | 0 |
| 0.7506944444444444 | 0 |
| 0.751388888888889 | 0 |
| 0.7520833333333333 | 0 |
| 0.7527777777777778 | 0 |
| 0.7534722222222222 | 0 |
| 0.7541666666666668 | 0 |
| 0.7548611111111111 | 0 |
| 0.7555555555555555 | 0 |
| 0.75625 | 0 |
| 0.7569444444444445 | 0 |
| 0.7576388888888889 | 0 |
| 0.7583333333333333 | 0 |
| 0.7590277777777777 | 0 |
| 0.7597222222222223 | 0 |
| 0.7604166666666666 | 0 |
| 0.7611111111111111 | 0 |
| 0.7618055555555556 | 0 |
| 0.7625000000000001 | 0 |
| 0.7631944444444444 | 0 |
| 0.7638888888888888 | 0 |
| 0.7645833333333334 | 0 |
| 0.7652777777777778 | 0 |
| 0.7659722222222222 | 0 |
| 0.7666666666666666 | 0 |
| 0.7673611111111112 | 0 |
| 0.7680555555555556 | 0 |
| 0.7687499999999999 | 0 |
| 0.7694444444444444 | 0 |
| 0.7701388888888889 | 0 |
| 0.7708333333333334 | 0 |
| 0.7715277777777777 | 0 |
| 0.7722222222222223 | 0 |
| 0.7729166666666667 | 0 |
| 0.7736111111111111 | 0 |
| 0.7743055555555555 | 0 |
| 0.775 | 0 |
| 0.7756944444444445 | 0 |
| 0.7763888888888889 | 0 |
| 0.7770833333333332 | 0 |
| 0.7777777777777778 | 0 |
| 0.7784722222222222 | 0 |
| 0.7791666666666667 | 0 |
| 0.779861111111111 | 0 |
| 0.7805555555555556 | 0 |
| 0.78125 | 0 |
| 0.7819444444444444 | 0 |
| 0.782638888888889 | 0 |
| 0.7833333333333333 | 0 |
| 0.7840277777777778 | 0 |
| 0.7847222222222222 | 0 |
| 0.7854166666666668 | 0 |
| 0.7861111111111111 | 0 |
| 0.7868055555555555 | 0 |
| 0.7875 | 0 |
| 0.7881944444444445 | 0 |
| 0.7888888888888889 | 0 |
| 0.7895833333333333 | 0 |
| 0.7902777777777777 | 0 |
| 0.7909722222222223 | 0 |
| 0.7916666666666666 | 0 |
| 0.7923611111111111 | 0 |
| 0.7930555555555556 | 0 |
| 0.7937500000000001 | 0 |
| 0.7944444444444444 | 0 |
| 0.7951388888888888 | 0 |
| 0.7958333333333334 | 0 |
| 0.7965277777777778 | 0 |
| 0.7972222222222222 | 0 |
| 0.7979166666666666 | 0 |
| 0.7986111111111112 | 0 |
| 0.7993055555555556 | 0 |
| 0.7999999999999999 | 0 |
| 0.8006944444444444 | 0 |
| 0.8013888888888889 | 0 |
| 0.8020833333333334 | 0 |
| 0.8027777777777777 | 0 |
| 0.8034722222222223 | 0 |
| 0.8041666666666667 | 0 |
| 0.8048611111111111 | 0 |
| 0.8055555555555555 | 0 |
| 0.80625 | 0 |
| 0.8069444444444445 | 0 |
| 0.8076388888888889 | 0 |
| 0.8083333333333332 | 0 |
| 0.8090277777777778 | 0 |
| 0.8097222222222222 | 0 |
| 0.8104166666666667 | 0 |
| 0.811111111111111 | 0 |
| 0.8118055555555556 | 0 |
| 0.8125 | 0 |
| 0.8131944444444444 | 0 |
| 0.813888888888889 | 0 |
| 0.8145833333333333 | 0 |
| 0.8152777777777778 | 0 |
| 0.8159722222222222 | 0 |
| 0.8166666666666668 | 0 |
| 0.8173611111111111 | 0 |
| 0.8180555555555555 | 0 |
| 0.81875 | 0 |
| 0.8194444444444445 | 0 |
| 0.8201388888888889 | 0 |
| 0.8208333333333333 | 0 |
| 0.8215277777777777 | 0 |
| 0.8222222222222223 | 0 |
| 0.8229166666666666 | 0 |
| 0.8236111111111111 | 0 |
| 0.8243055555555556 | 0 |
| 0.8250000000000001 | 0 |
| 0.8256944444444444 | 0 |
| 0.8263888888888888 | 0 |
| 0.8270833333333334 | 0 |
| 0.8277777777777778 | 0 |
| 0.8284722222222222 | 0 |
| 0.8291666666666666 | 0 |
| 0.8298611111111112 | 0 |
| 0.8305555555555556 | 0 |
| 0.8312499999999999 | 0 |
| 0.8319444444444444 | 0 |
| 0.8326388888888889 | 0 |
| 0.8333333333333334 | 0 |
| 0.8340277777777777 | 0 |
| 0.8347222222222223 | 0 |
| 0.8354166666666667 | 0 |
| 0.8361111111111111 | 0 |
| 0.8368055555555555 | 0 |
| 0.8375 | 0 |
| 0.8381944444444445 | 0 |
| 0.8388888888888889 | 0 |
| 0.8395833333333332 | 0 |
| 0.8402777777777778 | 0 |
| 0.8409722222222222 | 0 |
| 0.8416666666666667 | 0 |
| 0.842361111111111 | 0 |
| 0.8430555555555556 | 0 |
| 0.84375 | 0 |
| 0.8444444444444444 | 0 |
| 0.845138888888889 | 0 |
| 0.8458333333333333 | 0 |
| 0.8465277777777778 | 0 |
| 0.8472222222222222 | 0 |
| 0.8479166666666668 | 0 |
| 0.8486111111111111 | 0 |
| 0.8493055555555555 | 0 |
| 0.85 | 0 |
| 0.8506944444444445 | 0 |
| 0.8513888888888889 | 0 |
| 0.8520833333333333 | 0 |
| 0.8527777777777777 | 0 |
| 0.8534722222222223 | 0 |
| 0.8541666666666666 | 0 |
| 0.8548611111111111 | 0 |
| 0.8555555555555556 | 0 |
| 0.8562500000000001 | 0 |
| 0.8569444444444444 | 0 |
| 0.8576388888888888 | 0 |
| 0.8583333333333334 | 0 |
| 0.8590277777777778 | 0 |
| 0.8597222222222222 | 0 |
| 0.8604166666666666 | 0 |
| 0.8611111111111112 | 0 |
| 0.8618055555555556 | 0 |
| 0.8624999999999999 | 0 |
| 0.8631944444444444 | 0 |
| 0.8638888888888889 | 0 |
| 0.8645833333333334 | 0 |
| 0.8652777777777777 | 0 |
| 0.8659722222222223 | 0 |
| 0.8666666666666667 | 0 |
| 0.8673611111111111 | 0 |
| 0.8680555555555555 | 0 |
| 0.86875 | 0 |
| 0.8694444444444445 | 0 |
| 0.8701388888888889 | 0 |
| 0.8708333333333332 | 0 |
| 0.8715277777777778 | 0 |
| 0.8722222222222222 | 0 |
| 0.8729166666666667 | 0 |
| 0.873611111111111 | 0 |
| 0.8743055555555556 | 0 |
| 0.875 | 0 |
| 0.8756944444444444 | 0 |
| 0.876388888888889 | 0 |
| 0.8770833333333333 | 0 |
| 0.8777777777777778 | 0 |
| 0.8784722222222222 | 0 |
| 0.8791666666666668 | 0 |
| 0.8798611111111111 | 0 |
| 0.8805555555555555 | 0 |
| 0.88125 | 0 |
| 0.8819444444444445 | 0 |
| 0.8826388888888889 | 0 |
| 0.8833333333333333 | 0 |
| 0.8840277777777777 | 0 |
| 0.8847222222222223 | 0 |
| 0.8854166666666666 | 0 |
| 0.8861111111111111 | 0 |
| 0.8868055555555556 | 0 |
| 0.8875000000000001 | 0 |
| 0.8881944444444444 | 0 |
| 0.8888888888888888 | 0 |
| 0.8895833333333334 | 0 |
| 0.8902777777777778 | 0 |
| 0.8909722222222222 | 0 |
| 0.8916666666666666 | 0 |
| 0.8923611111111112 | 0 |
| 0.8930555555555556 | 0 |
| 0.8937499999999999 | 0 |
| 0.8944444444444444 | 0 |
| 0.8951388888888889 | 0 |
| 0.8958333333333334 | 0 |
| 0.8965277777777777 | 0 |
| 0.8972222222222223 | 0 |
| 0.8979166666666667 | 0 |
| 0.8986111111111111 | 0 |
| 0.8993055555555555 | 0 |
| 0.9 | 0 |
| 0.9006944444444445 | 0 |
| 0.9013888888888889 | 0 |
| 0.9020833333333332 | 0 |
| 0.9027777777777778 | 0 |
| 0.9034722222222222 | 0 |
| 0.9041666666666667 | 0 |
| 0.904861111111111 | 0 |
| 0.9055555555555556 | 0 |
| 0.90625 | 0 |
| 0.9069444444444444 | 0 |
| 0.907638888888889 | 0 |
| 0.9083333333333333 | 0 |
| 0.9090277777777778 | 0 |
| 0.9097222222222222 | 0 |
| 0.9104166666666668 | 0 |
| 0.9111111111111111 | 0 |
| 0.9118055555555555 | 0 |
| 0.9125 | 0 |
| 0.9131944444444445 | 0 |
| 0.9138888888888889 | 0 |
| 0.9145833333333333 | 0 |
| 0.9152777777777777 | 0 |
| 0.9159722222222223 | 0 |
| 0.9166666666666666 | 0 |
| 0.9173611111111111 | 0 |
| 0.9180555555555556 | 0 |
| 0.9187500000000001 | 0 |
| 0.9194444444444444 | 0 |
| 0.9201388888888888 | 0 |
| 0.9208333333333334 | 0 |
| 0.9215277777777778 | 0 |
| 0.9222222222222222 | 0 |
| 0.9229166666666666 | 0 |
| 0.9236111111111112 | 0 |
| 0.9243055555555556 | 0 |
| 0.9249999999999999 | 0 |
| 0.9256944444444444 | 0 |
| 0.9263888888888889 | 0 |
| 0.9270833333333334 | 0 |
| 0.9277777777777777 | 0 |
| 0.9284722222222223 | 0 |
| 0.9291666666666667 | 0 |
| 0.9298611111111111 | 0 |
| 0.9305555555555555 | 0 |
| 0.93125 | 0 |
| 0.9319444444444445 | 0 |
| 0.9326388888888889 | 0 |
| 0.9333333333333332 | 0 |
| 0.9340277777777778 | 0 |
| 0.9347222222222222 | 0 |
| 0.9354166666666667 | 0 |
| 0.936111111111111 | 0 |
| 0.9368055555555556 | 0 |
| 0.9375 | 0 |
| 0.9381944444444444 | 0 |
| 0.938888888888889 | 0 |
| 0.9395833333333333 | 0 |
| 0.9402777777777778 | 0 |
| 0.9409722222222222 | 0 |
| 0.9416666666666668 | 0 |
| 0.9423611111111111 | 0 |
| 0.9430555555555555 | 0 |
| 0.94375 | 0 |
| 0.9444444444444445 | 0 |
| 0.9451388888888889 | 0 |
| 0.9458333333333333 | 0 |
| 0.9465277777777777 | 0 |
| 0.9472222222222223 | 0 |
| 0.9479166666666666 | 0 |
| 0.9486111111111111 | 0 |
| 0.9493055555555556 | 0 |
| 0.9500000000000001 | 0 |
| 0.9506944444444444 | 0 |
| 0.9513888888888888 | 0 |
| 0.9520833333333334 | 0 |
| 0.9527777777777778 | 0 |
| 0.9534722222222222 | 0 |
| 0.9541666666666666 | 0 |
| 0.9548611111111112 | 0 |
| 0.9555555555555556 | 0 |
| 0.9562499999999999 | 0 |
| 0.9569444444444444 | 0 |
| 0.9576388888888889 | 0 |
| 0.9583333333333334 | 0 |
| 0.9590277777777777 | 0 |
| 0.9597222222222223 | 0 |
| 0.9604166666666667 | 0 |
| 0.9611111111111111 | 0 |
| 0.9618055555555555 | 0 |
| 0.9625 | 0 |
| 0.9631944444444445 | 0 |
| 0.9638888888888889 | 0 |
| 0.9645833333333332 | 0 |
| 0.9652777777777778 | 0 |
| 0.9659722222222222 | 0 |
| 0.9666666666666667 | 0 |
| 0.967361111111111 | 0 |
| 0.9680555555555556 | 0 |
| 0.96875 | 0 |
| 0.9694444444444444 | 0 |
| 0.970138888888889 | 0 |
| 0.9708333333333333 | 0 |
| 0.9715277777777778 | 0 |
| 0.9722222222222222 | 0 |
| 0.9729166666666668 | 0 |
| 0.9736111111111111 | 0 |
| 0.9743055555555555 | 0 |
| 0.975 | 0 |
| 0.9756944444444445 | 0 |
| 0.9763888888888889 | 0 |
| 0.9770833333333333 | 0 |
| 0.9777777777777777 | 0 |
| 0.9784722222222223 | 0 |
| 0.9791666666666666 | 0 |
| 0.9798611111111111 | 0 |
| 0.9805555555555556 | 0 |
| 0.9812500000000001 | 0 |
| 0.9819444444444444 | 0 |
| 0.9826388888888888 | 0 |
| 0.9833333333333334 | 0 |
| 0.9840277777777778 | 0 |
| 0.9847222222222222 | 0 |
| 0.9854166666666666 | 0 |
| 0.9861111111111112 | 0 |
| 0.9868055555555556 | 0 |
| 0.9874999999999999 | 0 |
| 0.9881944444444444 | 0 |
| 0.9888888888888889 | 0 |
| 0.9895833333333334 | 0 |
| 0.9902777777777777 | 0 |
| 0.9909722222222223 | 0 |
| 0.9916666666666667 | 0 |
| 0.9923611111111111 | 0 |
| 0.9930555555555555 | 0 |
| 0.99375 | 0 |
| 0.9944444444444445 | 0 |
| 0.9951388888888889 | 0 |
| 0.9958333333333332 | 0 |
| 0.9965277777777778 | 0 |
| 0.9972222222222222 | 0 |
| 0.9979166666666667 | 0 |
| 0.998611111111111 | 0 |
| 0.9993055555555556 | 0 |